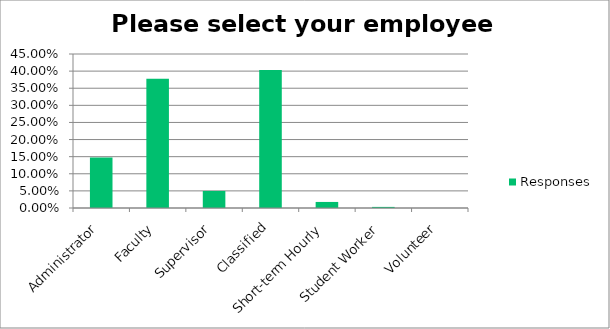
| Category | Responses |
|---|---|
| Administrator | 0.148 |
| Faculty | 0.378 |
| Supervisor | 0.05 |
| Classified | 0.404 |
| Short-term Hourly | 0.018 |
| Student Worker | 0.003 |
| Volunteer | 0 |